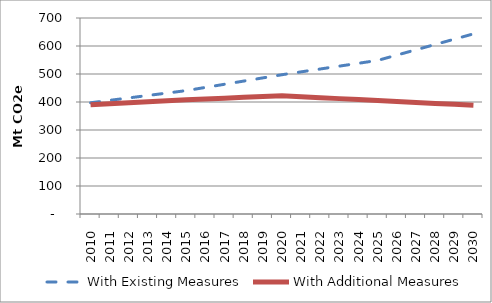
| Category |  With Existing Measures  |  With Additional Measures  |
|---|---|---|
| 2010.0 | 397.254 | 389.864 |
| 2011.0 | 405.939 | 393.478 |
| 2012.0 | 414.624 | 397.091 |
| 2013.0 | 423.31 | 400.705 |
| 2014.0 | 431.995 | 404.319 |
| 2015.0 | 440.681 | 407.933 |
| 2016.0 | 452.035 | 410.815 |
| 2017.0 | 463.389 | 413.698 |
| 2018.0 | 474.744 | 416.58 |
| 2019.0 | 486.098 | 419.463 |
| 2020.0 | 497.452 | 422.345 |
| 2021.0 | 507.681 | 418.918 |
| 2022.0 | 517.91 | 415.491 |
| 2023.0 | 528.14 | 412.064 |
| 2024.0 | 538.369 | 408.637 |
| 2025.0 | 548.598 | 405.21 |
| 2026.0 | 567.54 | 401.828 |
| 2027.0 | 586.482 | 398.446 |
| 2028.0 | 605.424 | 395.064 |
| 2029.0 | 624.367 | 391.682 |
| 2030.0 | 643.309 | 388.3 |